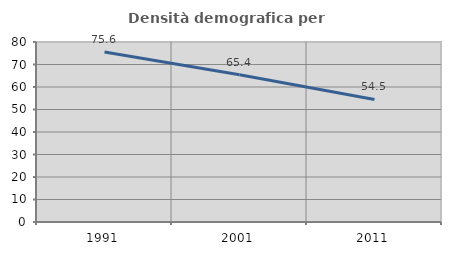
| Category | Densità demografica |
|---|---|
| 1991.0 | 75.552 |
| 2001.0 | 65.408 |
| 2011.0 | 54.474 |